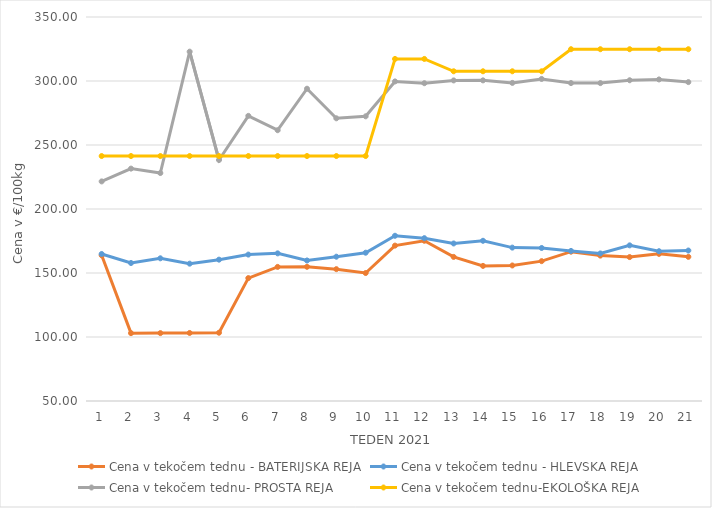
| Category | Cena v tekočem tednu - BATERIJSKA REJA | Cena v tekočem tednu - HLEVSKA REJA | Cena v tekočem tednu- PROSTA REJA | Cena v tekočem tednu-EKOLOŠKA REJA |
|---|---|---|---|---|
| 1.0 | 163.81 | 164.86 | 221.55 | 241.38 |
| 2.0 | 103.02 | 157.81 | 231.55 | 241.38 |
| 3.0 | 103.03 | 161.48 | 228.1 | 241.38 |
| 4.0 | 103.15 | 157.29 | 322.93 | 241.38 |
| 5.0 | 103.34 | 160.43 | 238.28 | 241.38 |
| 6.0 | 146.03 | 164.39 | 272.76 | 241.38 |
| 7.0 | 154.77 | 165.34 | 261.55 | 241.38 |
| 8.0 | 154.86 | 159.79 | 293.97 | 241.38 |
| 9.0 | 153 | 162.73 | 270.86 | 241.38 |
| 10.0 | 149.98 | 165.85 | 272.41 | 241.38 |
| 11.0 | 171.4 | 179.09 | 299.66 | 317.24 |
| 12.0 | 175.2 | 177.21 | 298.27 | 317.24 |
| 13.0 | 162.57 | 173.07 | 300.45 | 307.59 |
| 14.0 | 155.55 | 175.17 | 300.49 | 307.59 |
| 15.0 | 155.88 | 169.83 | 298.52 | 307.59 |
| 16.0 | 159.26 | 169.55 | 301.6 | 307.59 |
| 17.0 | 166.66 | 167.25 | 298.38 | 324.83 |
| 18.0 | 163.58 | 165.28 | 298.35 | 324.83 |
| 19.0 | 162.44 | 171.6 | 300.59 | 324.83 |
| 20.0 | 164.94 | 167.01 | 301.21 | 324.83 |
| 21.0 | 162.64 | 167.56 | 299.14 | 324.83 |